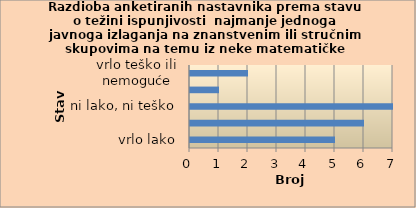
| Category | Series 0 |
|---|---|
| vrlo lako | 5 |
| lako | 6 |
| ni lako, ni teško | 7 |
| teško | 1 |
| vrlo teško ili nemoguće | 2 |